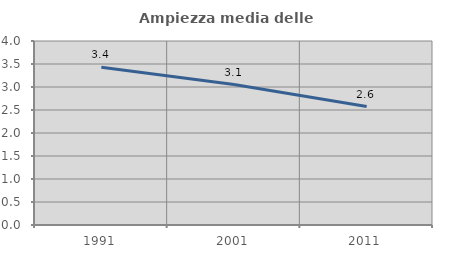
| Category | Ampiezza media delle famiglie |
|---|---|
| 1991.0 | 3.427 |
| 2001.0 | 3.053 |
| 2011.0 | 2.576 |